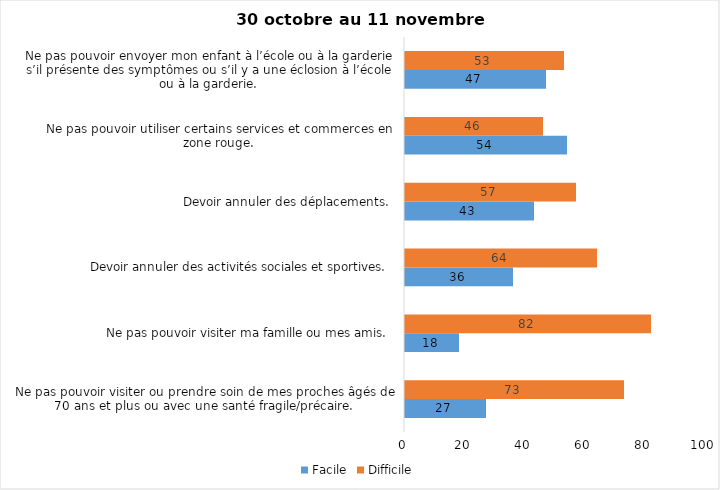
| Category | Facile | Difficile |
|---|---|---|
| Ne pas pouvoir visiter ou prendre soin de mes proches âgés de 70 ans et plus ou avec une santé fragile/précaire.  | 27 | 73 |
| Ne pas pouvoir visiter ma famille ou mes amis.  | 18 | 82 |
| Devoir annuler des activités sociales et sportives.  | 36 | 64 |
| Devoir annuler des déplacements.  | 43 | 57 |
| Ne pas pouvoir utiliser certains services et commerces en zone rouge.  | 54 | 46 |
| Ne pas pouvoir envoyer mon enfant à l’école ou à la garderie s’il présente des symptômes ou s’il y a une éclosion à l’école ou à la garderie.  | 47 | 53 |